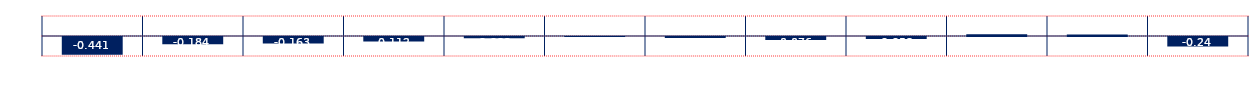
| Category | Spread |
|---|---|
| Mar 24, May 24 | -0.441 |
| Apr 24, Jun 24 | -0.184 |
| May 24, Jul 24 | -0.163 |
| Jun 24, Aug 24 | -0.112 |
| Jul 24, Sep 24 | -0.032 |
| Aug 24, Oct 24 | 0.002 |
| Sep 24, Nov 24 | -0.022 |
| Oct 24, Dec 24 | -0.076 |
| Nov 24, Jan 25 | -0.053 |
| Dec 24, Feb 25 | 0.046 |
| Jan 25, Mar 25 | 0.04 |
| Feb 25, Apr 25 | -0.24 |